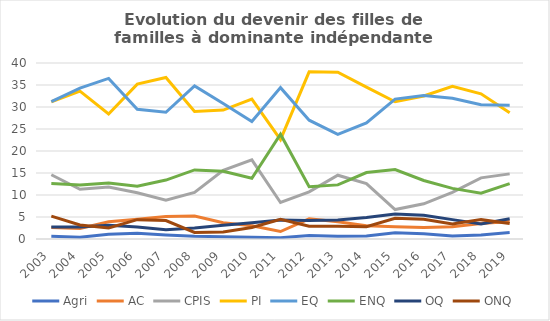
| Category | Agri | AC | CPIS | PI | EQ | ENQ | OQ | ONQ |
|---|---|---|---|---|---|---|---|---|
| 2003.0 | 0.6 | 2.6 | 14.6 | 31.2 | 31.2 | 12.6 | 2.7 | 5.2 |
| 2004.0 | 0.4 | 2.4 | 11.3 | 33.6 | 34.3 | 12.3 | 2.7 | 3.2 |
| 2005.0 | 1.1 | 3.9 | 11.8 | 28.4 | 36.5 | 12.7 | 3.1 | 2.5 |
| 2006.0 | 1.3 | 4.5 | 10.5 | 35.2 | 29.5 | 12 | 2.7 | 4.4 |
| 2007.0 | 0.9 | 5.1 | 8.8 | 36.7 | 28.8 | 13.4 | 2.1 | 4.2 |
| 2008.0 | 0.6 | 5.2 | 10.6 | 29 | 34.8 | 15.7 | 2.5 | 1.5 |
| 2009.0 | 0.5 | 3.7 | 15.6 | 29.3 | 30.8 | 15.4 | 3.1 | 1.6 |
| 2010.0 | 0.4 | 3 | 18 | 31.8 | 26.7 | 13.8 | 3.7 | 2.6 |
| 2011.0 | 0.3 | 1.7 | 8.3 | 22.6 | 34.4 | 23.8 | 4.3 | 4.5 |
| 2012.0 | 0.8 | 4.6 | 10.7 | 38 | 27 | 11.9 | 4.2 | 2.9 |
| 2013.0 | 0.6 | 3.9 | 14.5 | 37.9 | 23.8 | 12.3 | 4.3 | 2.9 |
| 2014.0 | 0.7 | 3 | 12.6 | 34.5 | 26.4 | 15.1 | 4.9 | 2.8 |
| 2015.0 | 1.4 | 2.8 | 6.7 | 31.2 | 31.8 | 15.8 | 5.7 | 4.7 |
| 2016.0 | 1.2 | 2.6 | 8 | 32.5 | 32.6 | 13.3 | 5.4 | 4.5 |
| 2017.0 | 0.7 | 2.8 | 10.6 | 34.7 | 32 | 11.5 | 4.4 | 3.4 |
| 2018.0 | 0.9 | 3.5 | 13.9 | 33 | 30.5 | 10.4 | 3.4 | 4.4 |
| 2019.0 | 1.5 | 4 | 14.8 | 28.7 | 30.4 | 12.6 | 4.6 | 3.5 |